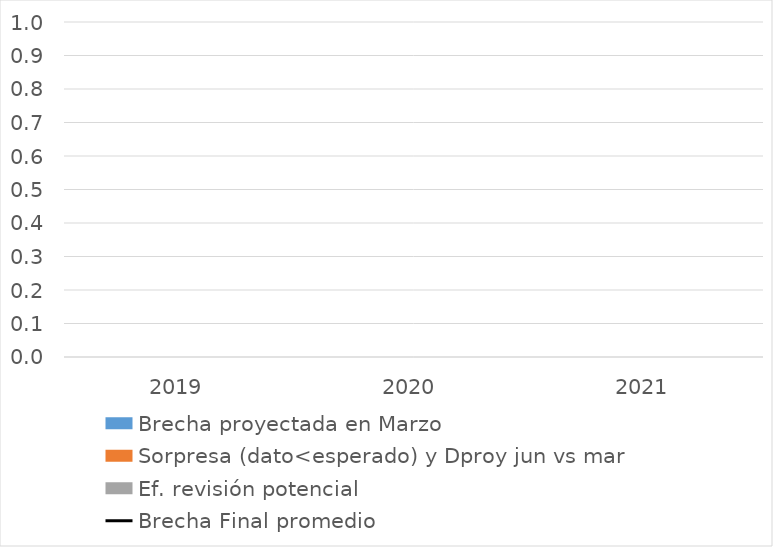
| Category | Brecha proyectada en Marzo | Sorpresa (dato<esperado) y Dproy jun vs mar | Ef. revisión potencial |
|---|---|---|---|
| 2019.0 | 0 | 0 | 0 |
| 2020.0 | 0 | 0 | 0 |
| 2021.0 | 0 | 0 | 0 |